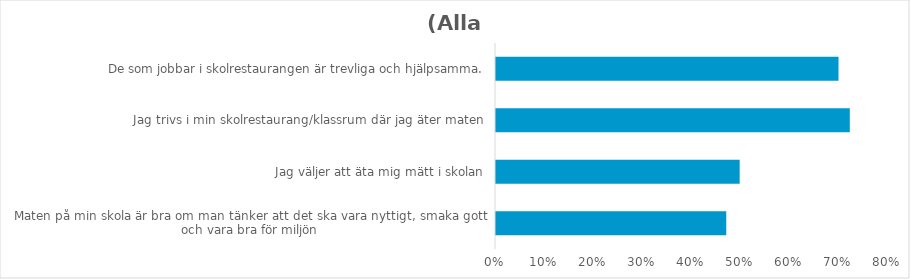
| Category | (Alla) |
|---|---|
| Maten på min skola är bra om man tänker att det ska vara nyttigt, smaka gott och vara bra för miljön | 0.469 |
| Jag väljer att äta mig mätt i skolan | 0.496 |
| Jag trivs i min skolrestaurang/klassrum där jag äter maten | 0.72 |
| De som jobbar i skolrestaurangen är trevliga och hjälpsamma. | 0.697 |